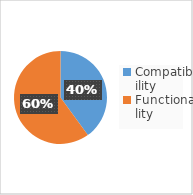
| Category | Series 0 |
|---|---|
| Compatibility | 4 |
| Functionality | 6 |